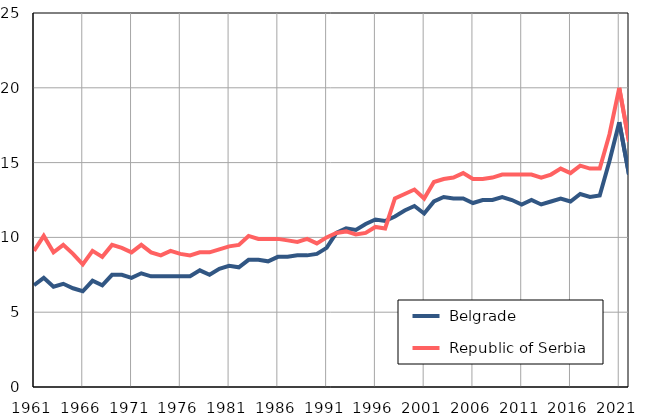
| Category |  Belgrade |  Republic of Serbia |
|---|---|---|
| 1961.0 | 6.8 | 9.1 |
| 1962.0 | 7.3 | 10.1 |
| 1963.0 | 6.7 | 9 |
| 1964.0 | 6.9 | 9.5 |
| 1965.0 | 6.6 | 8.9 |
| 1966.0 | 6.4 | 8.2 |
| 1967.0 | 7.1 | 9.1 |
| 1968.0 | 6.8 | 8.7 |
| 1969.0 | 7.5 | 9.5 |
| 1970.0 | 7.5 | 9.3 |
| 1971.0 | 7.3 | 9 |
| 1972.0 | 7.6 | 9.5 |
| 1973.0 | 7.4 | 9 |
| 1974.0 | 7.4 | 8.8 |
| 1975.0 | 7.4 | 9.1 |
| 1976.0 | 7.4 | 8.9 |
| 1977.0 | 7.4 | 8.8 |
| 1978.0 | 7.8 | 9 |
| 1979.0 | 7.5 | 9 |
| 1980.0 | 7.9 | 9.2 |
| 1981.0 | 8.1 | 9.4 |
| 1982.0 | 8 | 9.5 |
| 1983.0 | 8.5 | 10.1 |
| 1984.0 | 8.5 | 9.9 |
| 1985.0 | 8.4 | 9.9 |
| 1986.0 | 8.7 | 9.9 |
| 1987.0 | 8.7 | 9.8 |
| 1988.0 | 8.8 | 9.7 |
| 1989.0 | 8.8 | 9.9 |
| 1990.0 | 8.9 | 9.6 |
| 1991.0 | 9.3 | 10 |
| 1992.0 | 10.3 | 10.3 |
| 1993.0 | 10.6 | 10.4 |
| 1994.0 | 10.5 | 10.2 |
| 1995.0 | 10.9 | 10.3 |
| 1996.0 | 11.2 | 10.7 |
| 1997.0 | 11.1 | 10.6 |
| 1998.0 | 11.4 | 12.6 |
| 1999.0 | 11.8 | 12.9 |
| 2000.0 | 12.1 | 13.2 |
| 2001.0 | 11.6 | 12.6 |
| 2002.0 | 12.4 | 13.7 |
| 2003.0 | 12.7 | 13.9 |
| 2004.0 | 12.6 | 14 |
| 2005.0 | 12.6 | 14.3 |
| 2006.0 | 12.3 | 13.9 |
| 2007.0 | 12.5 | 13.9 |
| 2008.0 | 12.5 | 14 |
| 2009.0 | 12.7 | 14.2 |
| 2010.0 | 12.5 | 14.2 |
| 2011.0 | 12.2 | 14.2 |
| 2012.0 | 12.5 | 14.2 |
| 2013.0 | 12.2 | 14 |
| 2014.0 | 12.4 | 14.2 |
| 2015.0 | 12.6 | 14.6 |
| 2016.0 | 12.4 | 14.3 |
| 2017.0 | 12.9 | 14.8 |
| 2018.0 | 12.7 | 14.6 |
| 2019.0 | 12.8 | 14.6 |
| 2020.0 | 15.1 | 16.9 |
| 2021.0 | 17.7 | 20 |
| 2022.0 | 14.2 | 16.4 |